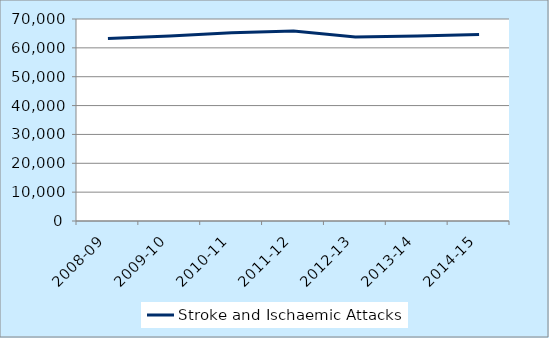
| Category | Stroke and Ischaemic Attacks |
|---|---|
| 2008-09 | 63256 |
| 2009-10 | 64132 |
| 2010-11 | 65203 |
| 2011-12 | 65854 |
| 2012-13 | 63724 |
| 2013-14 | 64093 |
| 2014-15 | 64641 |